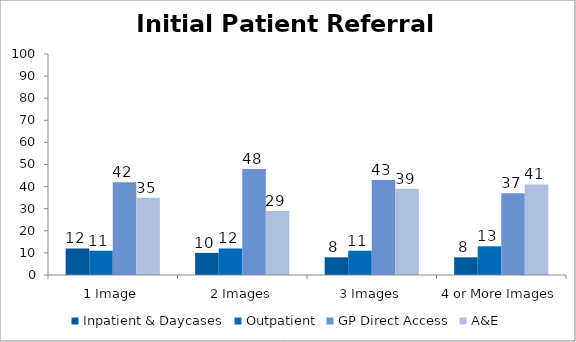
| Category | Inpatient & Daycases | Outpatient | GP Direct Access | A&E |
|---|---|---|---|---|
| 1 Image | 12 | 11 | 42 | 35 |
| 2 Images | 10 | 12 | 48 | 29 |
| 3 Images | 8 | 11 | 43 | 39 |
| 4 or More Images | 8 | 13 | 37 | 41 |